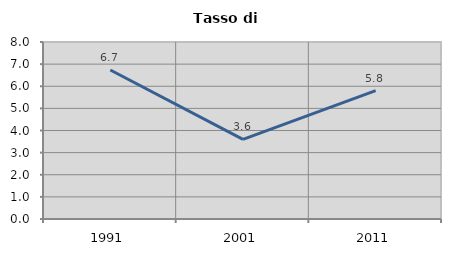
| Category | Tasso di disoccupazione   |
|---|---|
| 1991.0 | 6.736 |
| 2001.0 | 3.601 |
| 2011.0 | 5.804 |